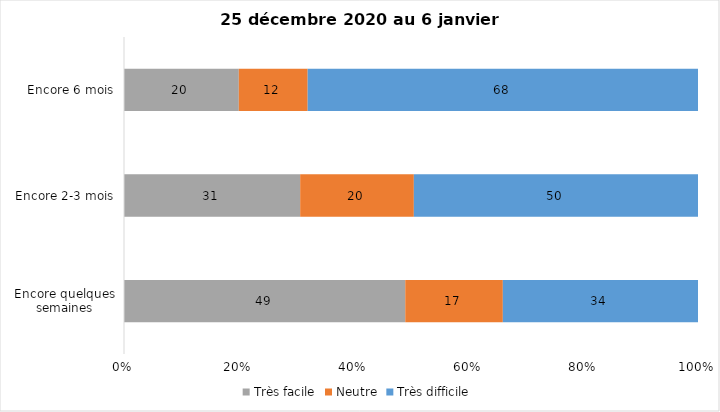
| Category | Très facile | Neutre | Très difficile |
|---|---|---|---|
| Encore quelques semaines | 49 | 17 | 34 |
| Encore 2-3 mois | 31 | 20 | 50 |
| Encore 6 mois | 20 | 12 | 68 |